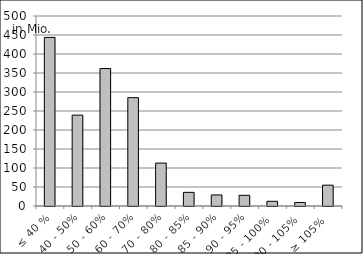
| Category | Volumen |
|---|---|
| ≤ 40 % | 443589474.959 |
| 40 - 50% | 239137090.735 |
| 50 - 60% | 361645788.986 |
| 60 - 70% | 285151060.168 |
| 70 - 80% | 112977411.515 |
| 80 - 85% | 35920197.2 |
| 85 - 90% | 29082764.699 |
| 90 - 95% | 28133508.547 |
| 95 - 100% | 12394593.914 |
| 100 - 105% | 9320535.614 |
| ≥ 105% | 54823779.19 |